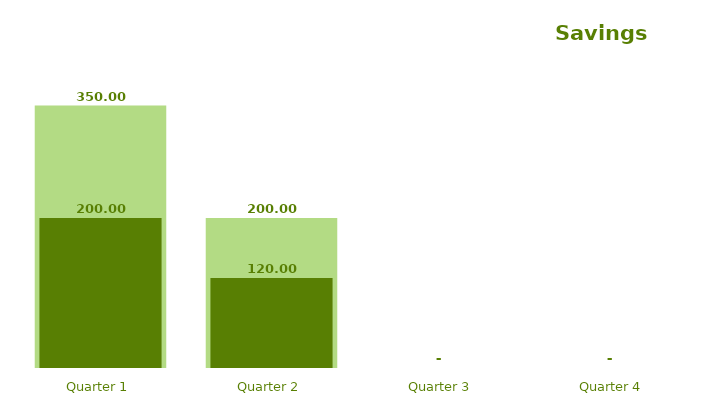
| Category | Series 0 |
|---|---|
| Quarter 1 | 350 |
| Quarter 2 | 200 |
| Quarter 3 | 0 |
| Quarter 4 | 0 |